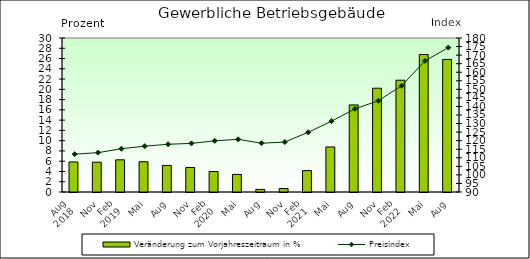
| Category | Veränderung zum Vorjahreszeitraum in % |
|---|---|
| 0 | 5.855 |
| 1 | 5.805 |
| 2 | 6.267 |
| 3 | 5.893 |
| 4 | 5.174 |
| 5 | 4.779 |
| 6 | 3.99 |
| 7 | 3.425 |
| 8 | 0.509 |
| 9 | 0.676 |
| 10 | 4.17 |
| 11 | 8.775 |
| 12 | 16.962 |
| 13 | 20.218 |
| 14 | 21.777 |
| 15 | 26.788 |
| 16 | 25.83 |